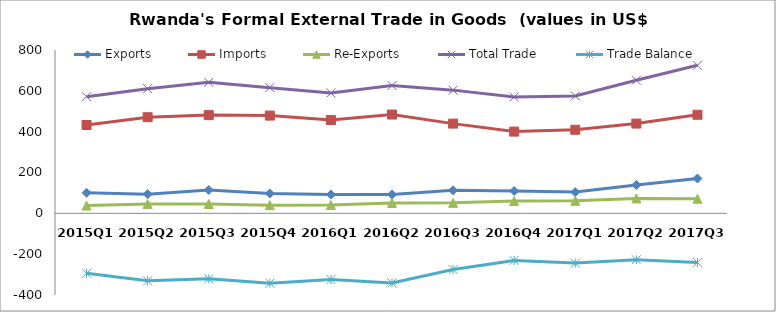
| Category | Exports | Imports | Re-Exports | Total Trade | Trade Balance |
|---|---|---|---|---|---|
| 2015Q1 | 100.645 | 432.606 | 38.092 | 571.343 | -293.87 |
| 2015Q2 | 93.892 | 470.703 | 46.126 | 610.721 | -330.685 |
| 2015Q3 | 114.24 | 481.145 | 46.053 | 641.438 | -320.853 |
| 2015Q4 | 97.026 | 478.754 | 39.897 | 615.677 | -341.831 |
| 2016Q1 | 91.795 | 456.929 | 41.031 | 589.755 | -324.103 |
| 2016Q2 | 92.237 | 483.863 | 50.433 | 626.533 | -341.192 |
| 2016Q3 | 112.536 | 439.389 | 51.515 | 603.44 | -275.338 |
| 2016Q4 | 109.503 | 400.306 | 60.303 | 570.112 | -230.5 |
| 2017Q1 | 104.064 | 409.239 | 61.473 | 574.776 | -243.702 |
| 2017Q2 | 139.242 | 439.68 | 73.169 | 652.091 | -227.269 |
| 2017Q3 | 170.661 | 482.863 | 71.566 | 725.09 | -240.636 |